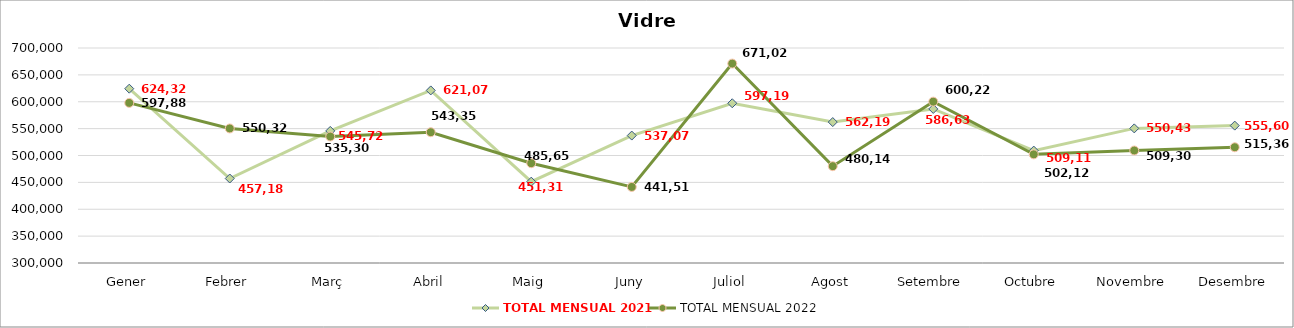
| Category | TOTAL MENSUAL 2021 | TOTAL MENSUAL 2022 |
|---|---|---|
| Gener | 624320.57 | 597880.58 |
| Febrer | 457183.09 | 550327.78 |
| Març | 545729.31 | 535305.976 |
| Abril | 621077.87 | 543358.242 |
| Maig | 451311.6 | 485655.208 |
| Juny | 537072.04 | 441517.641 |
| Juliol | 597192.23 | 671025.044 |
| Agost | 562194.69 | 480146.196 |
| Setembre | 586630 | 600221.146 |
| Octubre | 509111.17 | 502126.968 |
| Novembre | 550437.83 | 509309.186 |
| Desembre | 555604 | 515359.689 |